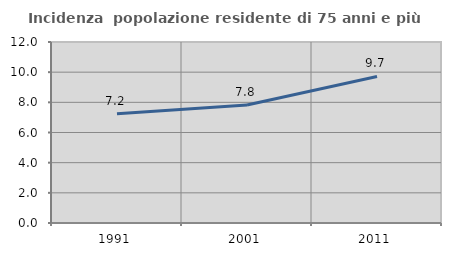
| Category | Incidenza  popolazione residente di 75 anni e più |
|---|---|
| 1991.0 | 7.245 |
| 2001.0 | 7.82 |
| 2011.0 | 9.714 |